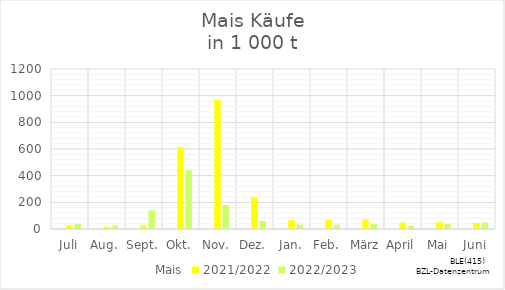
| Category | Mais | 2021/2022 | 2022/2023 |
|---|---|---|---|
| Juli |  | 27.984 | 37.687 |
| Aug. |  | 18.932 | 27.917 |
| Sept. |  | 27.879 | 139.634 |
| Okt. |  | 614.613 | 442.342 |
| Nov. |  | 968.323 | 179.542 |
| Dez. |  | 236.85 | 59.626 |
| Jan. |  | 65.407 | 33.147 |
| Feb. |  | 68.286 | 31.265 |
| März |  | 70.963 | 35.799 |
| April |  | 48.484 | 24.384 |
| Mai |  | 50.516 | 36.805 |
| Juni |  | 46.032 | 48.765 |